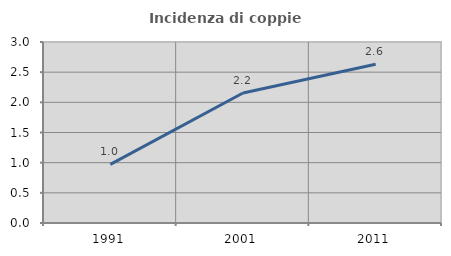
| Category | Incidenza di coppie miste |
|---|---|
| 1991.0 | 0.971 |
| 2001.0 | 2.155 |
| 2011.0 | 2.632 |